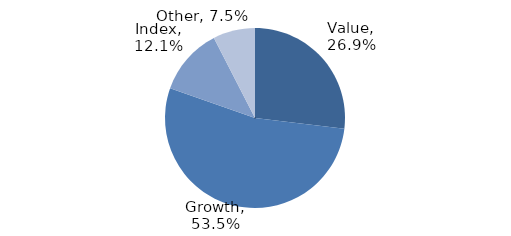
| Category | Investment Style |
|---|---|
| Value | 0.269 |
| Growth | 0.535 |
| Index | 0.121 |
| Other | 0.075 |